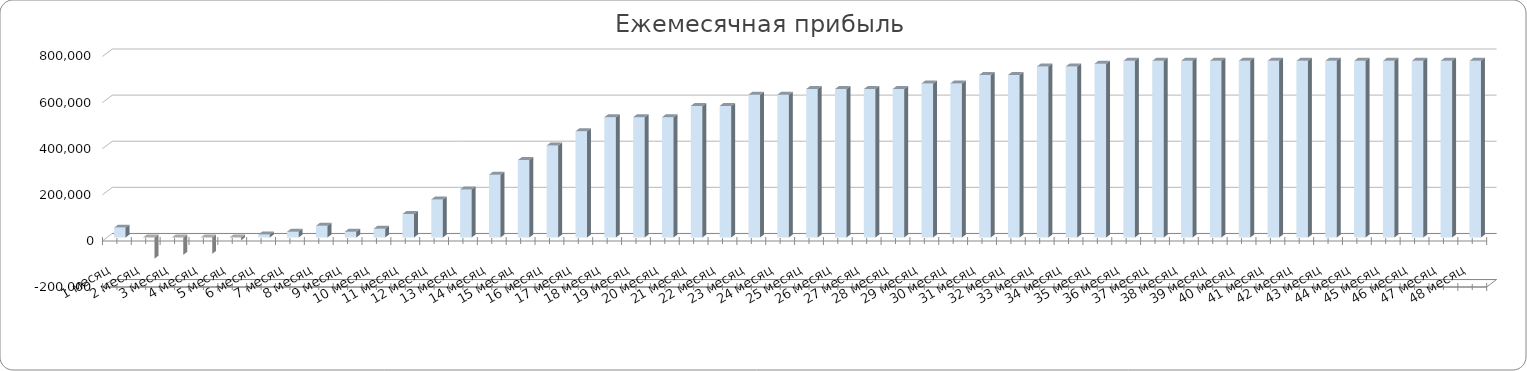
| Category | Series 0 |
|---|---|
| 1 месяц | 42830 |
| 2 месяц | -92005 |
| 3 месяц | -75450 |
| 4 месяц | -71301 |
| 5 месяц | -12720 |
| 6 месяц | 12690 |
| 7 месяц | 25395 |
| 8 месяц | 50805 |
| 9 месяц | 25395 |
| 10 месяц | 38100 |
| 11 месяц | 101625 |
| 12 месяц | 165150 |
| 13 месяц | 208675 |
| 14 месяц | 272200 |
| 15 месяц | 335725 |
| 16 месяц | 399250 |
| 17 месяц | 460825 |
| 18 месяц | 521900 |
| 19 месяц | 521900 |
| 20 месяц | 521900 |
| 21 месяц | 570760 |
| 22 месяц | 570760 |
| 23 месяц | 619620 |
| 24 месяц | 619620 |
| 25 месяц | 644050 |
| 26 месяц | 644050 |
| 27 месяц | 644050 |
| 28 месяц | 644050 |
| 29 месяц | 668480 |
| 30 месяц | 668480 |
| 31 месяц | 705125 |
| 32 месяц | 705125 |
| 33 месяц | 741770 |
| 34 месяц | 741770 |
| 35 месяц | 753985 |
| 36 месяц | 766200 |
| 37 месяц | 766200 |
| 38 месяц | 766200 |
| 39 месяц | 766200 |
| 40 месяц | 766200 |
| 41 месяц | 766200 |
| 42 месяц | 766200 |
| 43 месяц | 766200 |
| 44 месяц | 766200 |
| 45 месяц | 766200 |
| 46 месяц | 766200 |
| 47 месяц | 766200 |
| 48 месяц | 766200 |